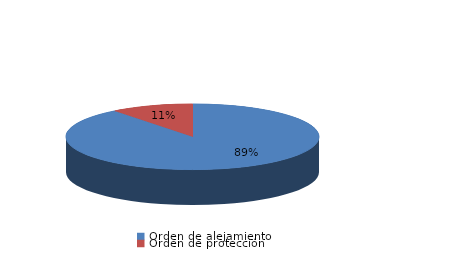
| Category | Series 0 |
|---|---|
| Orden de alejamiento | 34 |
| Orden de protección | 4 |